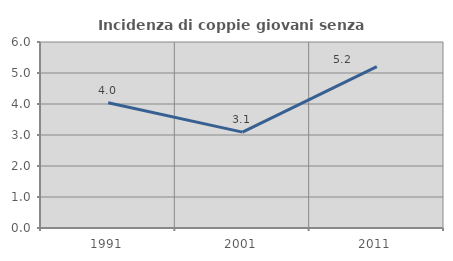
| Category | Incidenza di coppie giovani senza figli |
|---|---|
| 1991.0 | 4.04 |
| 2001.0 | 3.093 |
| 2011.0 | 5.208 |